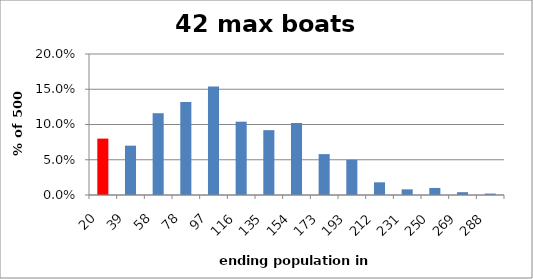
| Category | 42 max boats allowed |
|---|---|
| 20.0 | 0.08 |
| 39.180094130658354 | 0.07 |
| 58.3601882613167 | 0.116 |
| 77.54028239197504 | 0.132 |
| 96.7203765226334 | 0.154 |
| 115.90047065329176 | 0.104 |
| 135.0805647839501 | 0.092 |
| 154.26065891460848 | 0.102 |
| 173.44075304526683 | 0.058 |
| 192.6208471759252 | 0.05 |
| 211.80094130658355 | 0.018 |
| 230.9810354372419 | 0.008 |
| 250.16112956790028 | 0.01 |
| 269.3412236985586 | 0.004 |
| 287.7016019007051 | 0.002 |